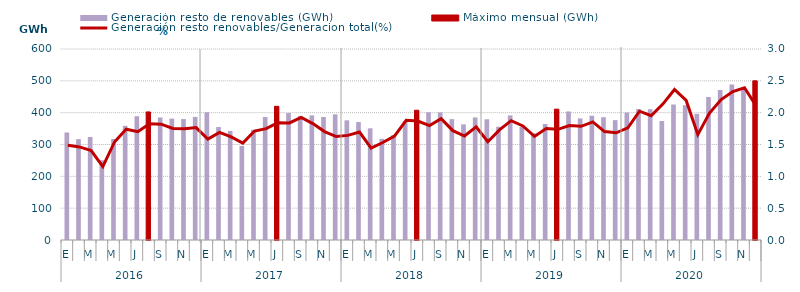
| Category | Generación resto de renovables (GWh) | Máximo mensual (GWh) |
|---|---|---|
| 0 | 337.767 | 0 |
| 1 | 316.822 | 0 |
| 2 | 323.67 | 0 |
| 3 | 250.537 | 0 |
| 4 | 317.278 | 0 |
| 5 | 358.69 | 0 |
| 6 | 388.956 | 0 |
| 7 | 402.341 | 402.341 |
| 8 | 384.904 | 0 |
| 9 | 381.279 | 0 |
| 10 | 379.932 | 0 |
| 11 | 386.775 | 0 |
| 12 | 401.263 | 0 |
| 13 | 354.803 | 0 |
| 14 | 342.55 | 0 |
| 15 | 295.467 | 0 |
| 16 | 346.165 | 0 |
| 17 | 386.302 | 0 |
| 18 | 419.869 | 419.869 |
| 19 | 398.846 | 0 |
| 20 | 389.738 | 0 |
| 21 | 391.345 | 0 |
| 22 | 386.468 | 0 |
| 23 | 394.771 | 0 |
| 24 | 375.856 | 0 |
| 25 | 370.492 | 0 |
| 26 | 350.867 | 0 |
| 27 | 317.941 | 0 |
| 28 | 329.126 | 0 |
| 29 | 373.059 | 0 |
| 30 | 407.594 | 407.594 |
| 31 | 401.454 | 0 |
| 32 | 401.026 | 0 |
| 33 | 379.66 | 0 |
| 34 | 363.125 | 0 |
| 35 | 384.971 | 0 |
| 36 | 379.277 | 0 |
| 37 | 355.918 | 0 |
| 38 | 391.364 | 0 |
| 39 | 354.875 | 0 |
| 40 | 335.219 | 0 |
| 41 | 364.42 | 0 |
| 42 | 411.073 | 411.073 |
| 43 | 403.995 | 0 |
| 44 | 381.972 | 0 |
| 45 | 390.427 | 0 |
| 46 | 385.72 | 0 |
| 47 | 376.518 | 0 |
| 48 | 400.687 | 0 |
| 49 | 411.424 | 0 |
| 50 | 410.586 | 0 |
| 51 | 373.796 | 0 |
| 52 | 425.384 | 0 |
| 53 | 423.064 | 0 |
| 54 | 396.347 | 0 |
| 55 | 449.541 | 0 |
| 56 | 470.821 | 0 |
| 57 | 488.125 | 0 |
| 58 | 475.582 | 0 |
| 59 | 499.942 | 499.942 |